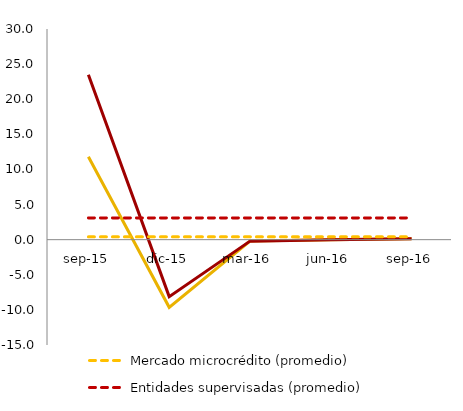
| Category | Mercado de microcrédito | Entidades supervisadas | Mercado microcrédito (promedio) | Entidades supervisadas (promedio) |
|---|---|---|---|---|
| sep-15 | 11.8 | 23.5 | 0.4 | 3.1 |
| dic-15 | -9.635 | -8.111 | 0.4 | 3.1 |
| mar-16 | -0.204 | -0.209 | 0.4 | 3.1 |
| jun-16 | -0.014 | -0.008 | 0.4 | 3.1 |
| sep-16 | 0.131 | 0.13 | 0.4 | 3.1 |